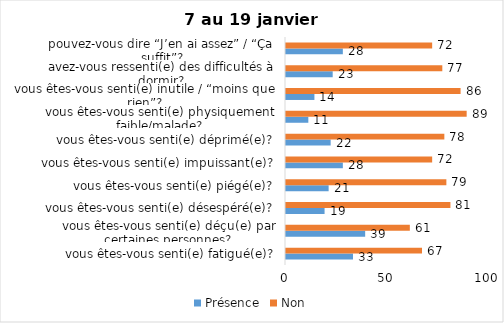
| Category | Présence | Non |
|---|---|---|
| vous êtes-vous senti(e) fatigué(e)? | 33 | 67 |
| vous êtes-vous senti(e) déçu(e) par certaines personnes? | 39 | 61 |
| vous êtes-vous senti(e) désespéré(e)? | 19 | 81 |
| vous êtes-vous senti(e) piégé(e)? | 21 | 79 |
| vous êtes-vous senti(e) impuissant(e)? | 28 | 72 |
| vous êtes-vous senti(e) déprimé(e)? | 22 | 78 |
| vous êtes-vous senti(e) physiquement faible/malade? | 11 | 89 |
| vous êtes-vous senti(e) inutile / “moins que rien”? | 14 | 86 |
| avez-vous ressenti(e) des difficultés à dormir? | 23 | 77 |
| pouvez-vous dire “J’en ai assez” / “Ça suffit”? | 28 | 72 |